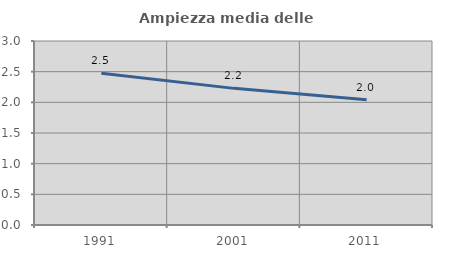
| Category | Ampiezza media delle famiglie |
|---|---|
| 1991.0 | 2.475 |
| 2001.0 | 2.228 |
| 2011.0 | 2.042 |